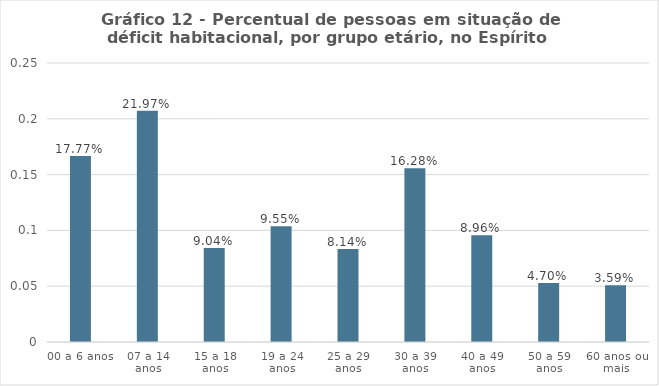
| Category | Series 0 |
|---|---|
| 00 a 6 anos | 0.167 |
| 07 a 14 anos | 0.207 |
| 15 a 18 anos | 0.084 |
| 19 a 24 anos | 0.104 |
| 25 a 29 anos | 0.083 |
| 30 a 39 anos | 0.156 |
| 40 a 49 anos | 0.096 |
| 50 a 59 anos | 0.053 |
| 60 anos ou mais | 0.051 |